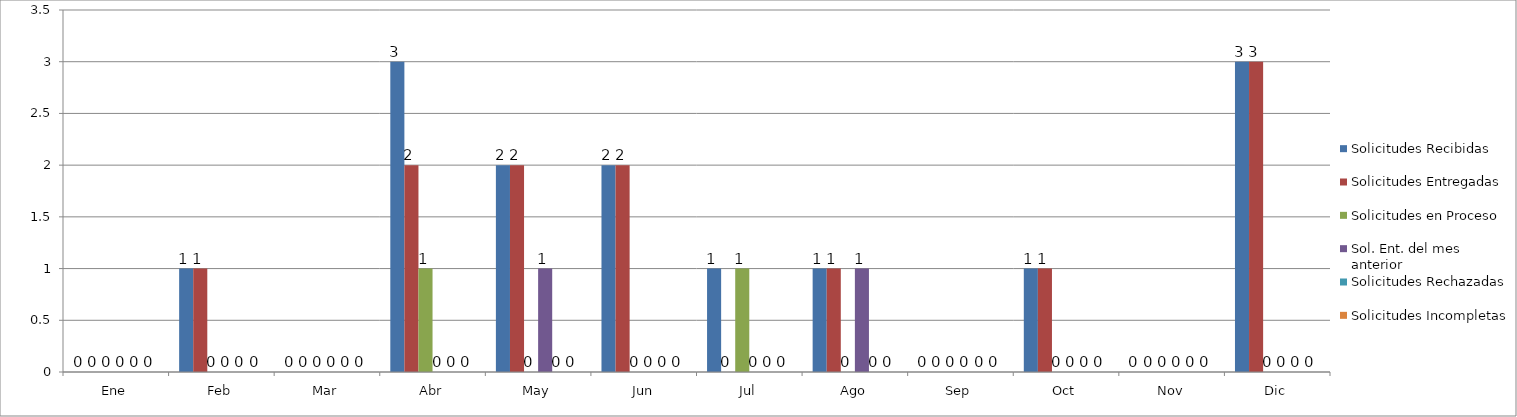
| Category | Solicitudes Recibidas  | Solicitudes Entregadas | Solicitudes en Proceso | Sol. Ent. del mes anterior | Solicitudes Rechazadas | Solicitudes Incompletas |
|---|---|---|---|---|---|---|
| Ene | 0 | 0 | 0 | 0 | 0 | 0 |
| Feb | 1 | 1 | 0 | 0 | 0 | 0 |
| Mar | 0 | 0 | 0 | 0 | 0 | 0 |
| Abr | 3 | 2 | 1 | 0 | 0 | 0 |
| May | 2 | 2 | 0 | 1 | 0 | 0 |
| Jun | 2 | 2 | 0 | 0 | 0 | 0 |
| Jul | 1 | 0 | 1 | 0 | 0 | 0 |
| Ago | 1 | 1 | 0 | 1 | 0 | 0 |
| Sep | 0 | 0 | 0 | 0 | 0 | 0 |
| Oct | 1 | 1 | 0 | 0 | 0 | 0 |
| Nov | 0 | 0 | 0 | 0 | 0 | 0 |
| Dic | 3 | 3 | 0 | 0 | 0 | 0 |